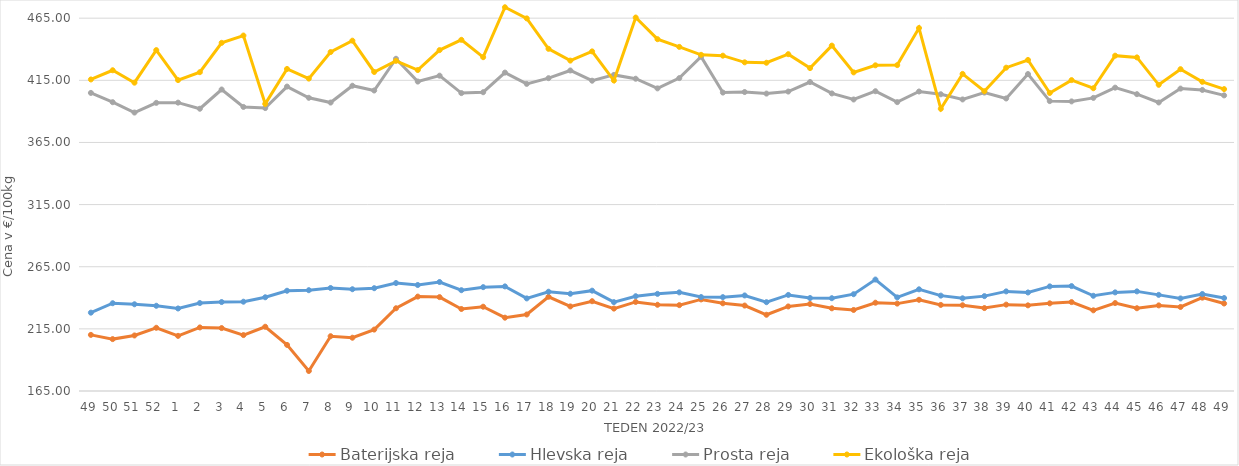
| Category | Baterijska reja | Hlevska reja | Prosta reja | Ekološka reja |
|---|---|---|---|---|
| 49.0 | 210.16 | 228.03 | 404.87 | 415.69 |
| 50.0 | 206.76 | 235.63 | 397.4 | 423.1 |
| 51.0 | 209.69 | 234.79 | 389.05 | 413.1 |
| 52.0 | 215.87 | 233.58 | 396.87 | 439.31 |
| 1.0 | 209.37 | 231.41 | 397.04 | 415.17 |
| 2.0 | 216.15 | 235.78 | 392.13 | 421.55 |
| 3.0 | 215.63 | 236.58 | 407.61 | 445.17 |
| 4.0 | 210 | 236.85 | 393.58 | 451.04 |
| 5.0 | 216.7 | 240.42 | 392.67 | 396.03 |
| 6.0 | 202.1 | 245.67 | 409.97 | 424.14 |
| 7.0 | 181.11 | 246.12 | 400.94 | 416.38 |
| 8.0 | 209.08 | 247.88 | 397.11 | 437.76 |
| 9.0 | 207.87 | 246.89 | 410.64 | 446.9 |
| 10.0 | 214.42 | 247.73 | 406.8 | 421.72 |
| 11.0 | 231.56 | 251.88 | 432.34 | 430.69 |
| 12.0 | 240.97 | 250.3 | 414 | 423.28 |
| 13.0 | 240.55 | 252.7 | 418.74 | 439.31 |
| 14.0 | 230.99 | 246.12 | 404.72 | 447.59 |
| 15.0 | 232.82 | 248.56 | 405.42 | 433.62 |
| 16.0 | 224 | 249.17 | 421.22 | 473.79 |
| 17.0 | 226.57 | 239.5 | 412.13 | 464.83 |
| 18.0 | 240.83 | 244.89 | 416.74 | 440.35 |
| 19.0 | 233.05 | 243.26 | 422.93 | 430.86 |
| 20.0 | 237.25 | 245.73 | 414.68 | 438.28 |
| 21.0 | 231.3 | 236.5 | 419.36 | 414.83 |
| 22.0 | 236.67 | 241.27 | 416.27 | 465.52 |
| 23.0 | 234.39 | 243.16 | 408.53 | 448.1 |
| 24.0 | 234.08 | 244.37 | 416.78 | 441.9 |
| 25.0 | 238.69 | 240.6 | 434.05 | 435.52 |
| 26.0 | 235.57 | 240.51 | 405.15 | 434.83 |
| 27.0 | 233.75 | 241.89 | 405.58 | 429.48 |
| 28.0 | 226.35 | 236.46 | 404.32 | 429.14 |
| 29.0 | 233.03 | 242.31 | 405.96 | 436.04 |
| 30.0 | 235 | 239.8 | 413.63 | 424.83 |
| 31.0 | 231.55 | 239.67 | 404.46 | 442.93 |
| 32.0 | 230.2 | 242.89 | 399.57 | 421.38 |
| 33.0 | 236.04 | 254.68 | 406.23 | 427.07 |
| 34.0 | 235.32 | 240.35 | 397.45 | 427.24 |
| 35.0 | 238.39 | 246.82 | 406 | 457.07 |
| 36.0 | 234.27 | 241.75 | 403.79 | 392.07 |
| 37.0 | 234 | 239.58 | 399.61 | 420.17 |
| 38.0 | 231.74 | 241.34 | 405.14 | 406.21 |
| 39.0 | 234.5 | 245.15 | 400.39 | 425.17 |
| 40.0 | 233.92 | 244.29 | 420.04 | 431.38 |
| 41.0 | 235.54 | 249.18 | 398.28 | 404.83 |
| 42.0 | 236.54 | 249.42 | 398.03 | 415.17 |
| 43.0 | 229.92 | 241.62 | 400.86 | 408.62 |
| 44.0 | 235.77 | 244.36 | 409.1 | 434.83 |
| 45.0 | 231.6 | 245.16 | 403.86 | 433.45 |
| 46.0 | 233.89 | 242.36 | 397.17 | 411.38 |
| 47.0 | 232.62 | 239.48 | 408.34 | 423.97 |
| 48.0 | 240.11 | 243.04 | 407.25 | 413.79 |
| 49.0 | 235.41 | 239.81 | 402.87 | 407.93 |